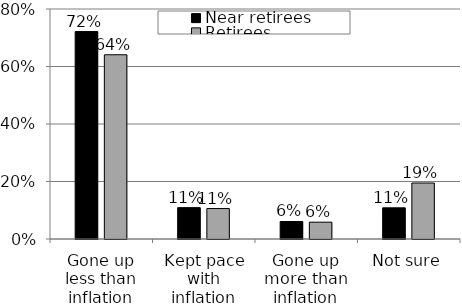
| Category | Near retirees | Retirees |
|---|---|---|
| Gone up less than inflation | 0.722 | 0.641 |
| Kept pace with inflation | 0.109 | 0.106 |
| Gone up more than inflation | 0.061 | 0.059 |
| Not sure | 0.108 | 0.195 |